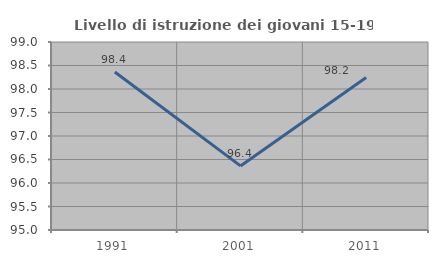
| Category | Livello di istruzione dei giovani 15-19 anni |
|---|---|
| 1991.0 | 98.361 |
| 2001.0 | 96.364 |
| 2011.0 | 98.246 |